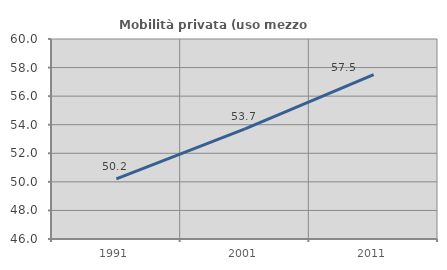
| Category | Mobilità privata (uso mezzo privato) |
|---|---|
| 1991.0 | 50.213 |
| 2001.0 | 53.709 |
| 2011.0 | 57.5 |